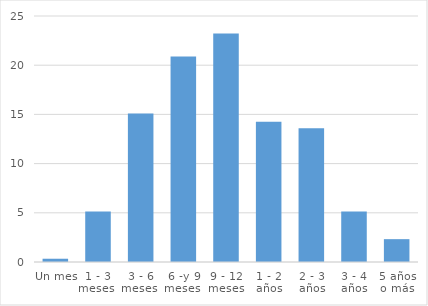
| Category | Series 0 |
|---|---|
| Un mes  | 0.332 |
| 1 - 3 meses  | 5.141 |
| 3 - 6 meses  | 15.091 |
| 6 -y 9 meses  | 20.896 |
| 9 - 12 meses | 23.217 |
| 1 - 2 años | 14.262 |
| 2 - 3 años | 13.599 |
| 3 - 4 años | 5.141 |
| 5 años o más | 2.322 |